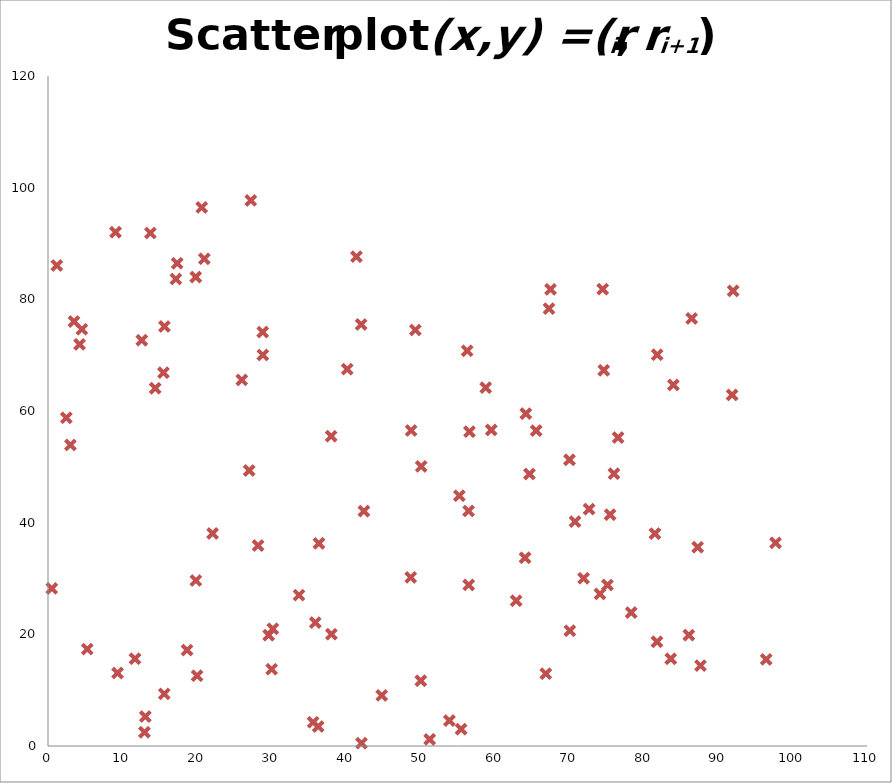
| Category | Scatter plot |
|---|---|
| 78.3301366501365 | 23.891 |
| 67.2905796225743 | 78.33 |
| 74.63930342342347 | 67.291 |
| 4.551542127818298 | 74.639 |
| 53.91346439469541 | 4.552 |
| 3.013173684547699 | 53.913 |
| 55.48442603045424 | 3.013 |
| 38.03746874345665 | 55.484 |
| 81.51601323745835 | 38.037 |
| 92.02249213130582 | 81.516 |
| 9.061288571301906 | 92.022 |
| 44.82205960029138 | 9.061 |
| 55.24643272261239 | 44.822 |
| 76.57188609304534 | 55.246 |
| 86.45516466963583 | 76.572 |
| 17.34907074956605 | 86.455 |
| 5.273445998441772 | 17.349 |
| 13.07661897197103 | 5.273 |
| 9.338485280433739 | 13.077 |
| 15.61753482370621 | 9.338 |
| 83.63917031822768 | 15.618 |
| 17.17591966737462 | 83.639 |
| 18.67338109353938 | 17.176 |
| 81.78863616220373 | 18.673 |
| 67.49813176386365 | 81.789 |
| 40.18649902946974 | 67.498 |
| 70.7825215429245 | 40.186 |
| 56.29743152220206 | 70.783 |
| 56.60492501624634 | 56.297 |
| 59.53181585520145 | 56.605 |
| 64.17773748006394 | 59.532 |
| 58.78542324271234 | 64.178 |
| 2.46242218586401 | 58.785 |
| 12.95631043003485 | 2.462 |
| 66.86207567416733 | 12.956 |
| 15.50989617967515 | 66.862 |
| 96.45863499718082 | 15.51 |
| 20.64650376932364 | 96.459 |
| 70.0858669618498 | 20.647 |
| 81.8161654551832 | 70.086 |
| 74.504877191025 | 81.816 |
| 49.34047919942679 | 74.505 |
| 27.0248542888356 | 49.34 |
| 33.71328403102562 | 27.025 |
| 64.07408170663716 | 33.713 |
| 14.39962867429553 | 64.074 |
| 87.6362267705757 | 14.4 |
| 41.43123907683729 | 87.636 |
| 75.4949135678377 | 41.431 |
| 42.06141454789757 | 75.495 |
| 42.43096842458911 | 42.061 |
| 72.67486230280419 | 42.431 |
| 12.59465432962624 | 72.675 |
| 20.02348611433351 | 12.595 |
| 38.06508332097703 | 20.023 |
| 22.10667025145637 | 38.065 |
| 35.90095747693878 | 22.107 |
| 28.21914466293196 | 35.901 |
| 0.507131994506538 | 28.219 |
| 42.09972763604281 | 0.507 |
| 56.48982882241484 | 42.1 |
| 65.5647037283455 | 56.49 |
| 26.02746502471559 | 65.565 |
| 62.87977792034594 | 26.027 |
| 91.88039110092015 | 62.88 |
| 13.75082042685514 | 91.88 |
| 30.03565913962867 | 13.751 |
| 71.93562752169697 | 30.036 |
| 4.24427927293366 | 71.936 |
| 35.60523053400878 | 4.244 |
| 87.25852202041567 | 35.605 |
| 20.99345809603731 | 87.259 |
| 30.19221183339131 | 20.993 |
| 48.7175469713234 | 30.192 |
| 64.6652332808472 | 48.718 |
| 83.9940248894857 | 64.665 |
| 19.84015054120386 | 83.994 |
| 29.64159154210331 | 19.84 |
| 19.85687436144652 | 29.642 |
| 86.0676913110377 | 19.857 |
| 1.190760969504412 | 86.068 |
| 51.26142172708976 | 1.191 |
| 70.03785881775974 | 51.261 |
| 28.85069543594032 | 70.038 |
| 56.50486767230932 | 28.851 |
| 48.77499011082234 | 56.505 |
| 76.019177831556 | 48.775 |
| 3.490925600226924 | 76.019 |
| 36.28883359343467 | 3.491 |
| 36.38481606049316 | 36.289 |
| 97.7139505333385 | 36.385 |
| 27.23832509786137 | 97.714 |
| 74.13864134165377 | 27.238 |
| 28.8370892072584 | 74.139 |
| 75.14403425882303 | 28.837 |
| 15.63962916478422 | 75.144 |
| 11.68479392188698 | 15.64 |
| 50.07229733091597 | 11.685 |
| 50.12312700384403 | 50.072 |